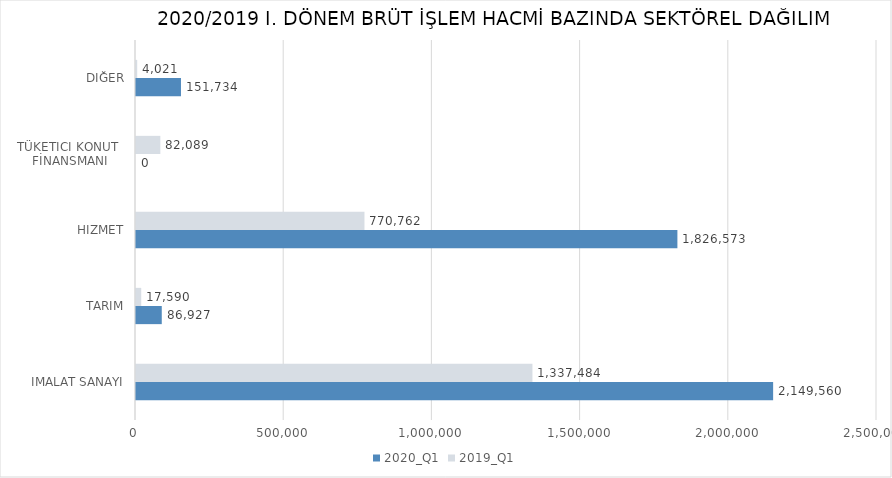
| Category | 2020_Q1 | 2019_Q1 |
|---|---|---|
| İMALAT SANAYİ | 2149559.827 | 1337483.755 |
| TARIM | 86927.157 | 17590 |
| HİZMET | 1826572.746 | 770761.846 |
| TÜKETİCİ KONUT 
FİNANSMANI | 0 | 82089 |
| DİĞER | 151734 | 4021 |